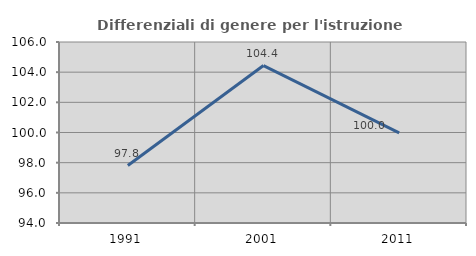
| Category | Differenziali di genere per l'istruzione superiore |
|---|---|
| 1991.0 | 97.808 |
| 2001.0 | 104.44 |
| 2011.0 | 99.974 |